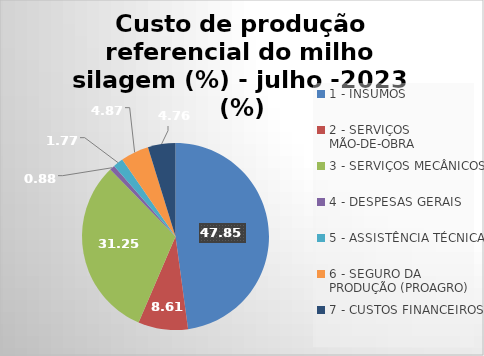
| Category | Series 0 |
|---|---|
| 1 - INSUMOS | 47.85 |
| 2 - SERVIÇOS MÃO-DE-OBRA | 8.611 |
| 3 - SERVIÇOS MECÂNICOS | 31.255 |
| 4 - DESPESAS GERAIS  | 0.877 |
| 5 - ASSISTÊNCIA TÉCNICA | 1.772 |
| 6 - SEGURO DA PRODUÇÃO (PROAGRO) | 4.873 |
| 7 - CUSTOS FINANCEIROS | 4.762 |